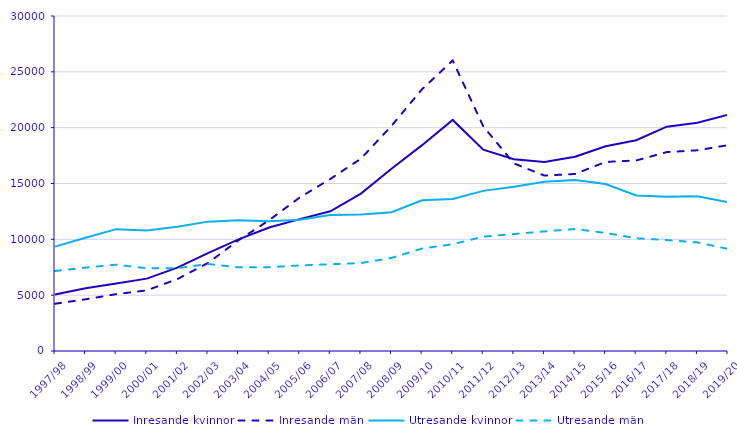
| Category | Inresande kvinnor | Inresande män | Utresande kvinnor | Utresande män |
|---|---|---|---|---|
| 1997/98 | 5052 | 4231 | 9348 | 7166 |
| 1998/99 | 5612 | 4631 | 10145 | 7471 |
| 1999/00 | 6042 | 5089 | 10911 | 7729 |
| 2000/01 | 6482 | 5432 | 10800 | 7412 |
| 2001/02 | 7468 | 6439 | 11128 | 7417 |
| 2002/03 | 8766 | 7883 | 11585 | 7792 |
| 2003/04 | 9994 | 9918 | 11720 | 7491 |
| 2004/05 | 11057 | 11715 | 11615 | 7506 |
| 2005/06 | 11811 | 13747 | 11747 | 7660 |
| 2006/07 | 12507 | 15404 | 12189 | 7770 |
| 2007/08 | 14094 | 17223 | 12220 | 7873 |
| 2008/09 | 16327 | 20164 | 12430 | 8334 |
| 2009/10 | 18434 | 23446 | 13496 | 9178 |
| 2010/11 | 20691 | 26014 | 13621 | 9560 |
| 2011/12 | 18036 | 20119 | 14340 | 10237 |
| 2012/13 | 17179 | 16800 | 14702 | 10477 |
| 2013/14 | 16925 | 15709 | 15166 | 10709 |
| 2014/15 | 17394 | 15854 | 15309 | 10926 |
| 2015/16 | 18337 | 16933 | 14953 | 10570 |
| 2016/17 | 18874 | 17062 | 13926 | 10098 |
| 2017/18 | 20087 | 17812 | 13817 | 9938 |
| 2018/19 | 20440 | 17974 | 13861 | 9723 |
| 2019/20 | 21153 | 18436 | 13334 | 9145 |